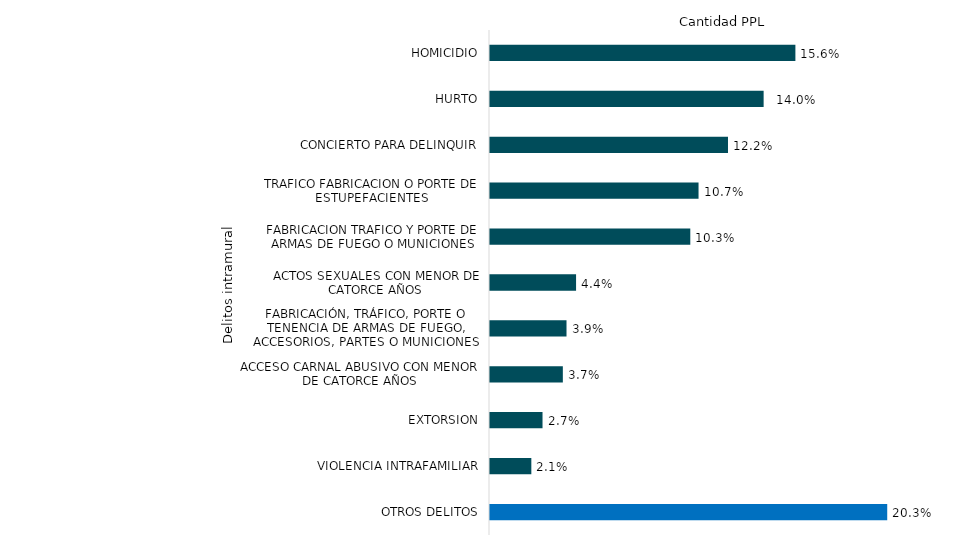
| Category | Total |
|---|---|
| HOMICIDIO | 25881 |
| HURTO | 23189 |
| CONCIERTO PARA DELINQUIR | 20169 |
| TRAFICO FABRICACION O PORTE DE ESTUPEFACIENTES | 17673 |
| FABRICACION TRAFICO Y PORTE DE ARMAS DE FUEGO O MUNICIONES | 16974 |
| ACTOS SEXUALES CON MENOR DE CATORCE AÑOS | 7294 |
| FABRICACIÓN, TRÁFICO, PORTE O TENENCIA DE ARMAS DE FUEGO, ACCESORIOS, PARTES O MUNICIONES | 6484 |
| ACCESO CARNAL ABUSIVO CON MENOR DE CATORCE AÑOS | 6173 |
| EXTORSION | 4451 |
| VIOLENCIA INTRAFAMILIAR | 3503 |
| OTROS DELITOS | 33663 |